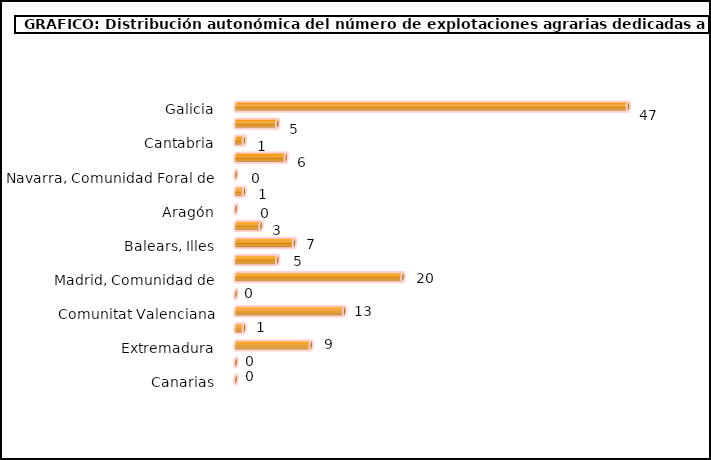
| Category | num. Explotaciones |
|---|---|
| Galicia | 47 |
| Asturias, Principado de | 5 |
| Cantabria | 1 |
| País Vasco | 6 |
| Navarra, Comunidad Foral de | 0 |
| Rioja, La | 1 |
| Aragón | 0 |
| Cataluña | 3 |
| Balears, Illes | 7 |
| Castilla y León | 5 |
| Madrid, Comunidad de | 20 |
| Castilla - La Mancha | 0 |
| Comunitat Valenciana | 13 |
| Murcia, Región de | 1 |
| Extremadura | 9 |
| Andalucía | 0 |
| Canarias | 0 |